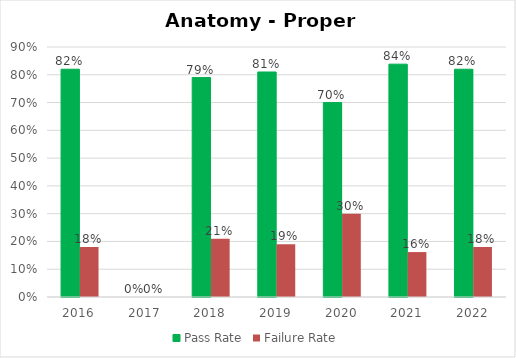
| Category | Pass Rate | Failure Rate |
|---|---|---|
| 2016.0 | 0.82 | 0.18 |
| 2017.0 | 0 | 0 |
| 2018.0 | 0.79 | 0.21 |
| 2019.0 | 0.81 | 0.19 |
| 2020.0 | 0.7 | 0.3 |
| 2021.0 | 0.838 | 0.162 |
| 2022.0 | 0.82 | 0.18 |